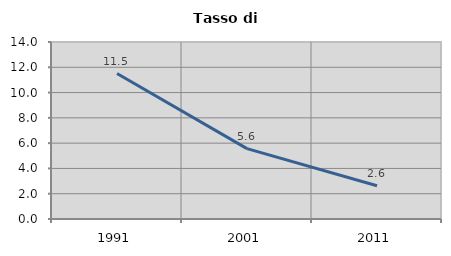
| Category | Tasso di disoccupazione   |
|---|---|
| 1991.0 | 11.507 |
| 2001.0 | 5.565 |
| 2011.0 | 2.627 |